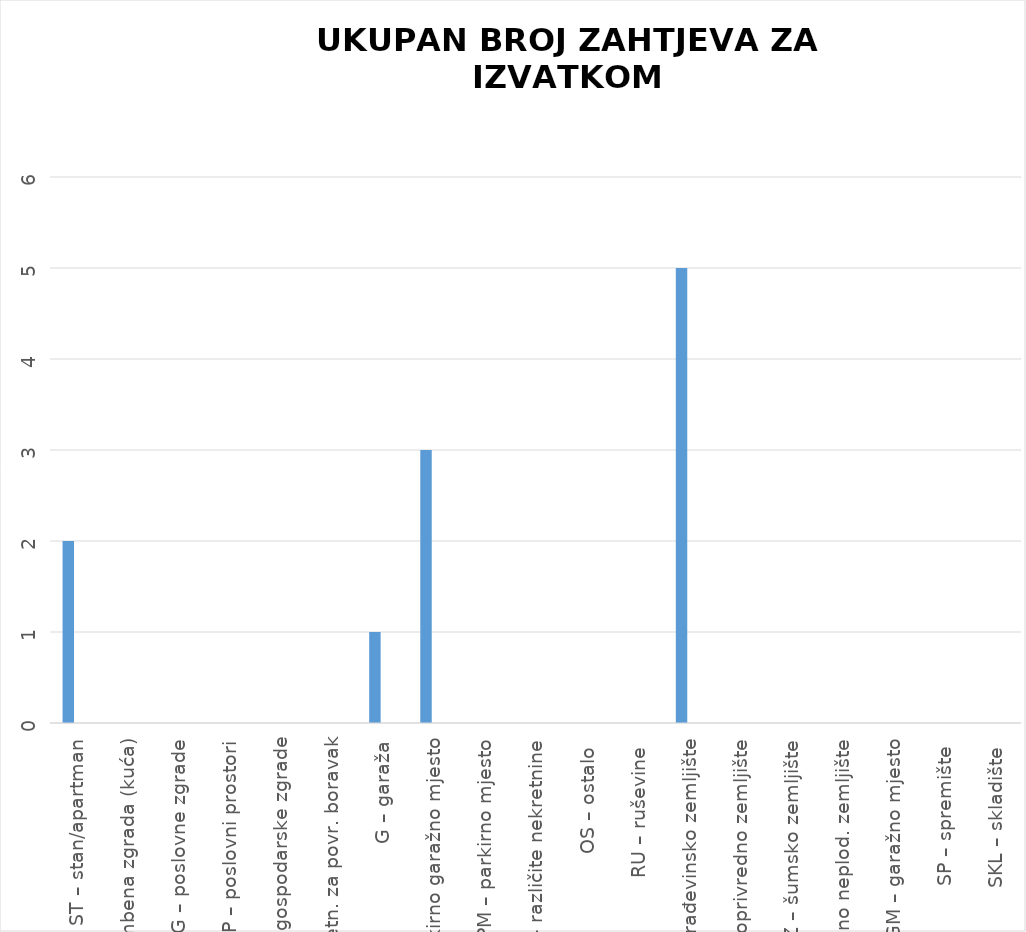
| Category | BROJ ZAPRIMLJENIH ZAHTJEVA KROZ APLIKACIJU eNekretnine | BROJ ZAPRIMLJENIH ZAHTJEVA IZVAN APLIKACIJE
(Popunjava službenik) |
|---|---|---|
| ST – stan/apartman | 2 | 0 |
| OK – stambena zgrada (kuća) | 0 | 0 |
| PZG – poslovne zgrade | 0 | 0 |
| PP – poslovni prostori | 0 | 0 |
| GZG – gospodarske zgrade | 0 | 0 |
| VIK – nekretn. za povr. boravak | 0 | 0 |
| G – garaža | 1 | 0 |
| PGM – parkirno garažno mjesto | 3 | 0 |
| VPM – parkirno mjesto | 0 | 0 |
| RN – različite nekretnine | 0 | 0 |
| OS – ostalo  | 0 | 0 |
| RU – ruševine  | 0 | 0 |
| GZ – građevinsko zemljište | 5 | 0 |
| PZ – poljoprivredno zemljište | 0 | 0 |
| ŠZ – šumsko zemljište | 0 | 0 |
| PNZ – prirodno neplod. zemljište | 0 | 0 |
| GM – garažno mjesto | 0 | 0 |
| SP – spremište  | 0 | 0 |
| SKL – skladište  | 0 | 0 |